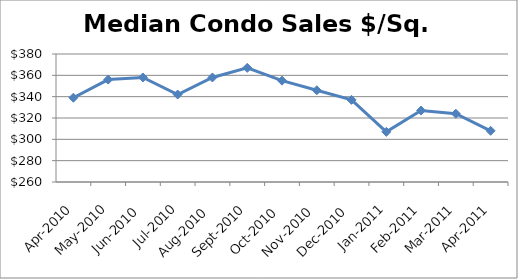
| Category | Series 0 |
|---|---|
| 2010-04-01 | 339 |
| 2010-05-01 | 356 |
| 2010-06-01 | 358 |
| 2010-07-01 | 342 |
| 2010-08-01 | 358 |
| 2010-09-01 | 367 |
| 2010-10-01 | 355 |
| 2010-11-01 | 346 |
| 2010-12-01 | 337 |
| 2011-01-01 | 307 |
| 2011-02-01 | 327 |
| 2011-03-01 | 324 |
| 2011-04-01 | 308 |